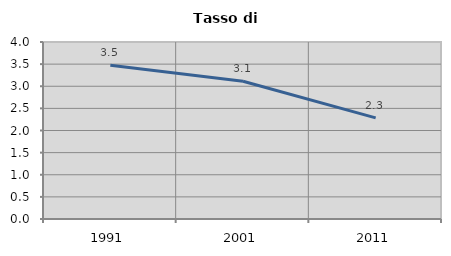
| Category | Tasso di disoccupazione   |
|---|---|
| 1991.0 | 3.476 |
| 2001.0 | 3.113 |
| 2011.0 | 2.285 |